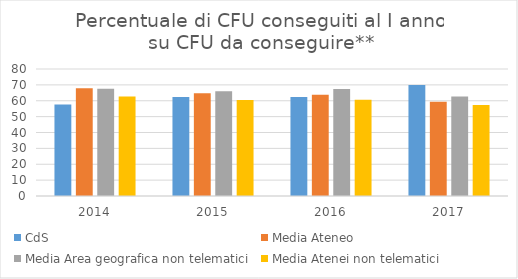
| Category | CdS | Media Ateneo | Media Area geografica non telematici | Media Atenei non telematici |
|---|---|---|---|---|
| 2014.0 | 57.7 | 67.8 | 67.6 | 62.7 |
| 2015.0 | 62.4 | 64.7 | 66 | 60.5 |
| 2016.0 | 62.3 | 63.8 | 67.4 | 60.6 |
| 2017.0 | 70 | 59.3 | 62.6 | 57.4 |